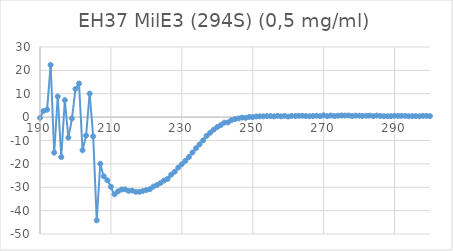
| Category | Series 0 |
|---|---|
| 300.0 | 0.419 |
| 299.0 | 0.527 |
| 298.0 | 0.548 |
| 297.0 | 0.367 |
| 296.0 | 0.456 |
| 295.0 | 0.408 |
| 294.0 | 0.381 |
| 293.0 | 0.533 |
| 292.0 | 0.526 |
| 291.0 | 0.511 |
| 290.0 | 0.59 |
| 289.0 | 0.424 |
| 288.0 | 0.395 |
| 287.0 | 0.391 |
| 286.0 | 0.5 |
| 285.0 | 0.66 |
| 284.0 | 0.431 |
| 283.0 | 0.651 |
| 282.0 | 0.579 |
| 281.0 | 0.484 |
| 280.0 | 0.608 |
| 279.0 | 0.626 |
| 278.0 | 0.484 |
| 277.0 | 0.708 |
| 276.0 | 0.66 |
| 275.0 | 0.689 |
| 274.0 | 0.589 |
| 273.0 | 0.471 |
| 272.0 | 0.68 |
| 271.0 | 0.404 |
| 270.0 | 0.762 |
| 269.0 | 0.413 |
| 268.0 | 0.591 |
| 267.0 | 0.469 |
| 266.0 | 0.39 |
| 265.0 | 0.459 |
| 264.0 | 0.587 |
| 263.0 | 0.555 |
| 262.0 | 0.485 |
| 261.0 | 0.525 |
| 260.0 | 0.255 |
| 259.0 | 0.524 |
| 258.0 | 0.326 |
| 257.0 | 0.525 |
| 256.0 | 0.315 |
| 255.0 | 0.441 |
| 254.0 | 0.466 |
| 253.0 | 0.347 |
| 252.0 | 0.328 |
| 251.0 | 0.277 |
| 250.0 | 0.025 |
| 249.0 | 0.088 |
| 248.0 | -0.338 |
| 247.0 | -0.191 |
| 246.0 | -0.571 |
| 245.0 | -0.835 |
| 244.0 | -1.27 |
| 243.0 | -2.267 |
| 242.0 | -2.348 |
| 241.0 | -3.395 |
| 240.0 | -4.233 |
| 239.0 | -5.369 |
| 238.0 | -6.684 |
| 237.0 | -8.004 |
| 236.0 | -9.954 |
| 235.0 | -11.685 |
| 234.0 | -13.313 |
| 233.0 | -15.147 |
| 232.0 | -17.082 |
| 231.0 | -18.686 |
| 230.0 | -20.134 |
| 229.0 | -21.576 |
| 228.0 | -23.368 |
| 227.0 | -24.632 |
| 226.0 | -26.393 |
| 225.0 | -27.127 |
| 224.0 | -28.176 |
| 223.0 | -29.059 |
| 222.0 | -29.699 |
| 221.0 | -30.828 |
| 220.0 | -31.167 |
| 219.0 | -31.612 |
| 218.0 | -31.945 |
| 217.0 | -31.934 |
| 216.0 | -31.426 |
| 215.0 | -31.56 |
| 214.0 | -30.915 |
| 213.0 | -30.971 |
| 212.0 | -31.758 |
| 211.0 | -33.029 |
| 210.0 | -29.822 |
| 209.0 | -27.011 |
| 208.0 | -25.305 |
| 207.0 | -19.96 |
| 206.0 | -44.164 |
| 205.0 | -8.207 |
| 204.0 | 10.076 |
| 203.0 | -7.887 |
| 202.0 | -14.184 |
| 201.0 | 14.359 |
| 200.0 | 12.049 |
| 199.0 | -0.552 |
| 198.0 | -8.771 |
| 197.0 | 7.259 |
| 196.0 | -17.086 |
| 195.0 | 8.828 |
| 194.0 | -15.194 |
| 193.0 | 22.31 |
| 192.0 | 3.195 |
| 191.0 | 2.637 |
| 190.0 | -0.293 |